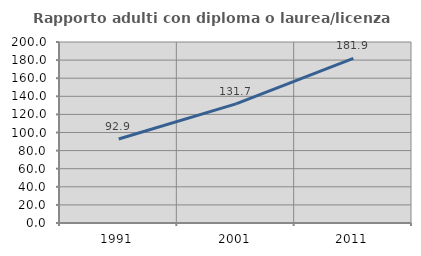
| Category | Rapporto adulti con diploma o laurea/licenza media  |
|---|---|
| 1991.0 | 92.875 |
| 2001.0 | 131.678 |
| 2011.0 | 181.888 |